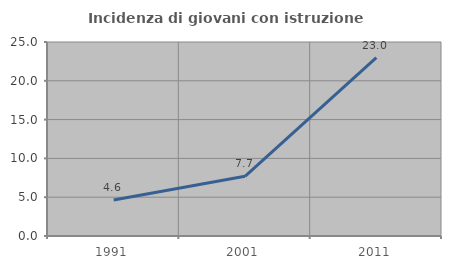
| Category | Incidenza di giovani con istruzione universitaria |
|---|---|
| 1991.0 | 4.628 |
| 2001.0 | 7.692 |
| 2011.0 | 22.982 |